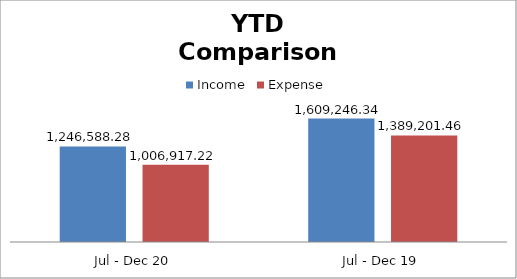
| Category | Income | Expense |
|---|---|---|
| Jul - Dec 20 | 1246588.28 | 1006917.22 |
| Jul - Dec 19 | 1609246.34 | 1389201.46 |